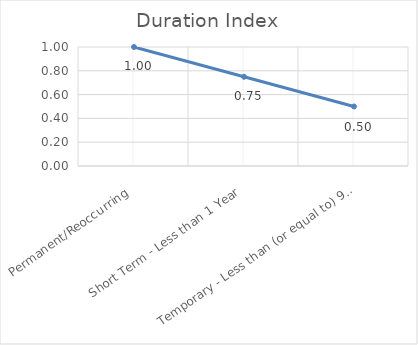
| Category | Duration Index |
|---|---|
| Permanent/Reoccurring | 1 |
| Short Term - Less than 1 Year | 0.75 |
| Temporary - Less than (or equal to) 90 Days | 0.5 |